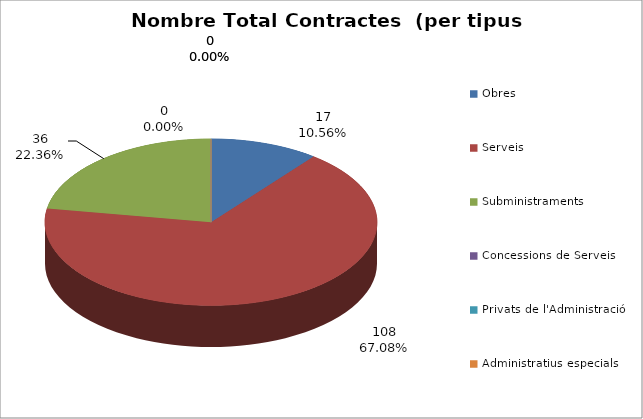
| Category | Nombre Total Contractes |
|---|---|
| Obres | 17 |
| Serveis | 108 |
| Subministraments | 36 |
| Concessions de Serveis | 0 |
| Privats de l'Administració | 0 |
| Administratius especials | 0 |